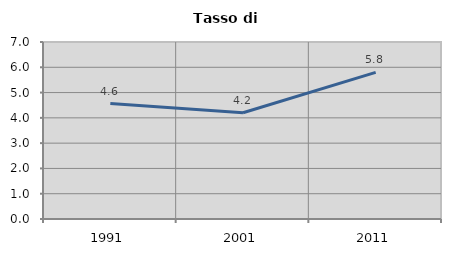
| Category | Tasso di disoccupazione   |
|---|---|
| 1991.0 | 4.567 |
| 2001.0 | 4.201 |
| 2011.0 | 5.798 |